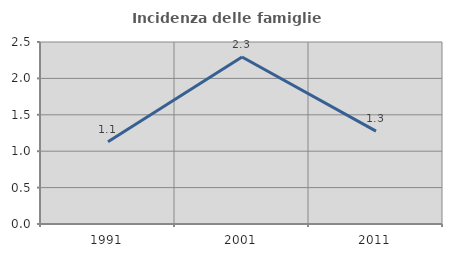
| Category | Incidenza delle famiglie numerose |
|---|---|
| 1991.0 | 1.13 |
| 2001.0 | 2.294 |
| 2011.0 | 1.277 |